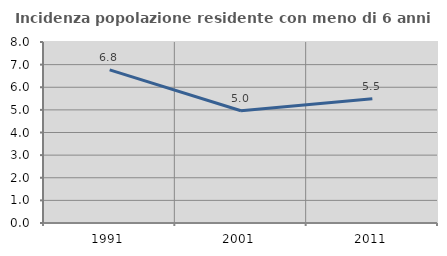
| Category | Incidenza popolazione residente con meno di 6 anni |
|---|---|
| 1991.0 | 6.769 |
| 2001.0 | 4.962 |
| 2011.0 | 5.488 |